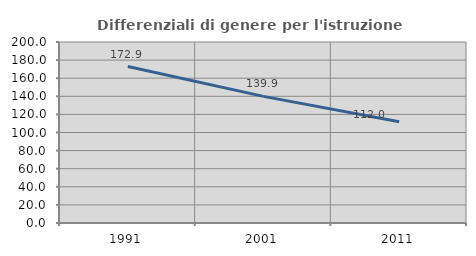
| Category | Differenziali di genere per l'istruzione superiore |
|---|---|
| 1991.0 | 172.918 |
| 2001.0 | 139.931 |
| 2011.0 | 111.971 |